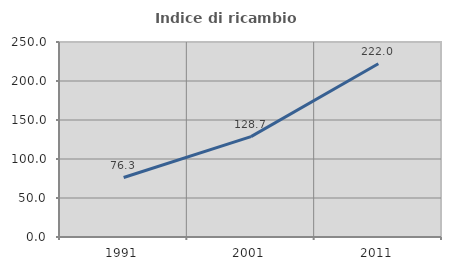
| Category | Indice di ricambio occupazionale  |
|---|---|
| 1991.0 | 76.282 |
| 2001.0 | 128.682 |
| 2011.0 | 222.034 |